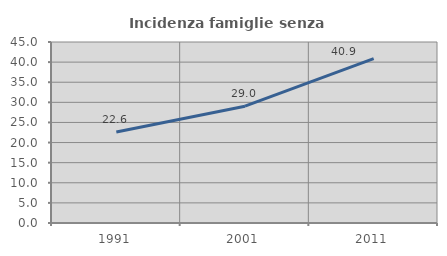
| Category | Incidenza famiglie senza nuclei |
|---|---|
| 1991.0 | 22.619 |
| 2001.0 | 29.048 |
| 2011.0 | 40.873 |